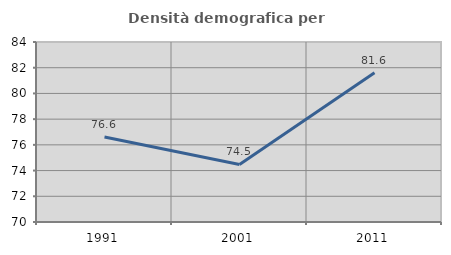
| Category | Densità demografica |
|---|---|
| 1991.0 | 76.611 |
| 2001.0 | 74.478 |
| 2011.0 | 81.612 |